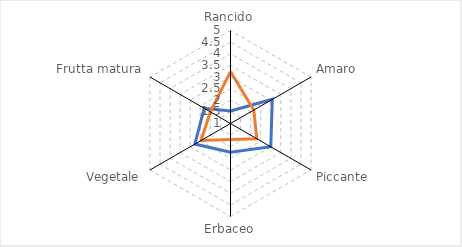
| Category | Series 0 | 3,230769231 |
|---|---|---|
| Rancido | 1.538 | 3.231 |
| Amaro | 3.077 | 2.154 |
| Piccante | 3 | 2.308 |
| Erbaceo | 2.231 | 1.692 |
| Vegetale | 2.769 | 2.462 |
| Frutta matura | 2.308 | 2 |